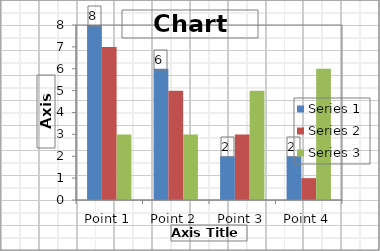
| Category | Series 1 | Series 2 | Series 3 |
|---|---|---|---|
| Point 1 | 8 | 7 | 3 |
| Point 2 | 6 | 5 | 3 |
| Point 3 | 2 | 3 | 5 |
| Point 4 | 2 | 1 | 6 |